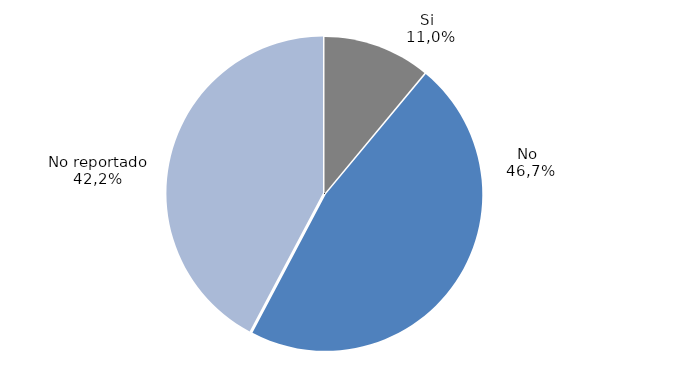
| Category | Series 0 |
|---|---|
| 0 | 1744 |
| 1 | 7392 |
| 2 | 6681 |